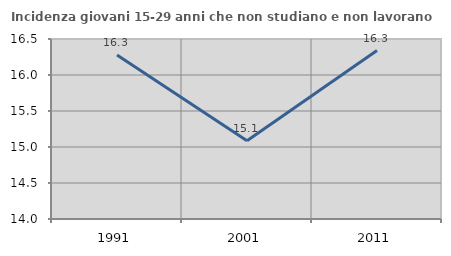
| Category | Incidenza giovani 15-29 anni che non studiano e non lavorano  |
|---|---|
| 1991.0 | 16.279 |
| 2001.0 | 15.086 |
| 2011.0 | 16.34 |